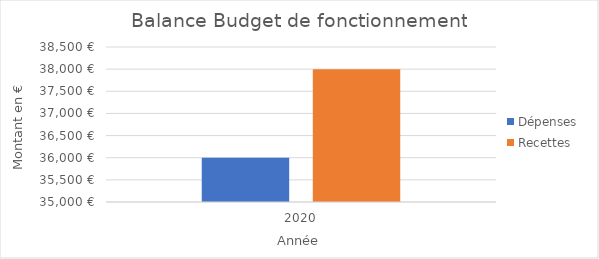
| Category |  Dépenses   |  Recettes  |
|---|---|---|
| 0 | 36000 | 38000 |